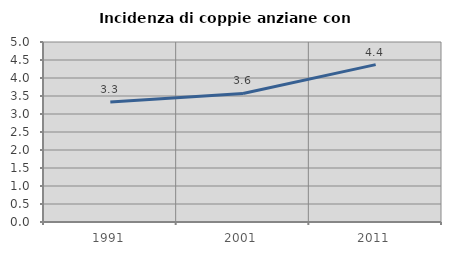
| Category | Incidenza di coppie anziane con figli |
|---|---|
| 1991.0 | 3.333 |
| 2001.0 | 3.571 |
| 2011.0 | 4.372 |